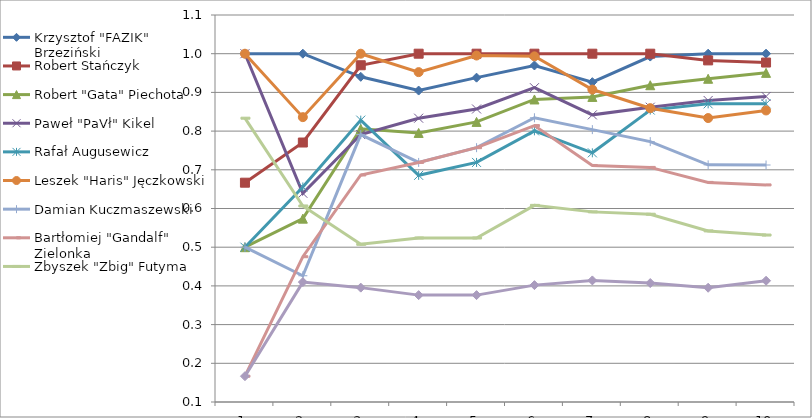
| Category | Krzysztof "FAZIK" Brzeziński | Robert Stańczyk | Robert "Gata" Piechota | Paweł "PaVł" Kikel | Rafał Augusewicz | Leszek "Haris" Jęczkowski | Damian Kuczmaszewski | Bartłomiej "Gandalf" Zielonka | Zbyszek "Zbig" Futyma | Dorota Janiszewska |
|---|---|---|---|---|---|---|---|---|---|---|
| 0 | 1 | 0.667 | 0.5 | 1 | 0.5 | 1 | 0.5 | 0.167 | 0.833 | 0.167 |
| 1 | 1 | 0.77 | 0.574 | 0.639 | 0.656 | 0.836 | 0.426 | 0.475 | 0.607 | 0.41 |
| 2 | 0.94 | 0.97 | 0.806 | 0.791 | 0.828 | 1 | 0.791 | 0.687 | 0.507 | 0.396 |
| 3 | 0.905 | 1 | 0.795 | 0.833 | 0.686 | 0.952 | 0.719 | 0.719 | 0.524 | 0.376 |
| 4 | 0.938 | 1 | 0.824 | 0.857 | 0.719 | 0.995 | 0.757 | 0.757 | 0.524 | 0.376 |
| 5 | 0.97 | 1 | 0.882 | 0.912 | 0.801 | 0.993 | 0.834 | 0.814 | 0.608 | 0.402 |
| 6 | 0.926 | 1 | 0.888 | 0.842 | 0.744 | 0.907 | 0.804 | 0.711 | 0.591 | 0.414 |
| 7 | 0.993 | 1 | 0.919 | 0.862 | 0.854 | 0.859 | 0.773 | 0.706 | 0.585 | 0.407 |
| 8 | 1 | 0.983 | 0.935 | 0.879 | 0.87 | 0.834 | 0.713 | 0.667 | 0.542 | 0.395 |
| 9 | 1 | 0.977 | 0.95 | 0.89 | 0.87 | 0.853 | 0.712 | 0.661 | 0.531 | 0.413 |